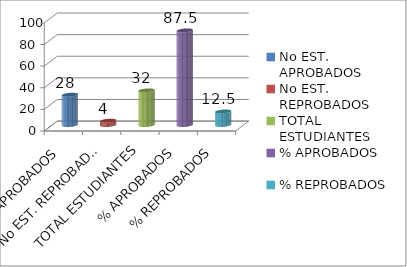
| Category | Series 0 |
|---|---|
| No EST. APROBADOS | 28 |
| No EST. REPROBADOS | 4 |
| TOTAL ESTUDIANTES | 32 |
| % APROBADOS | 87.5 |
| % REPROBADOS | 12.5 |